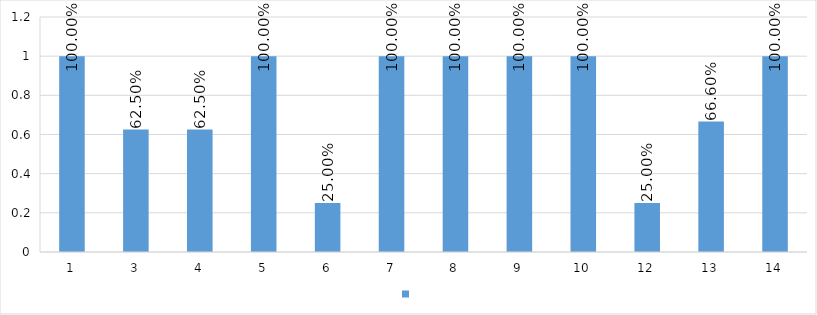
| Category | Series 0 |
|---|---|
| 1 | 1 |
| 3 | 0.625 |
| 4 | 0.625 |
| 5 | 1 |
| 6 | 0.25 |
| 7 | 1 |
| 8 | 1 |
| 9 | 1 |
| 10 | 1 |
| 12 | 0.25 |
| 13 | 0.666 |
| 14 | 1 |